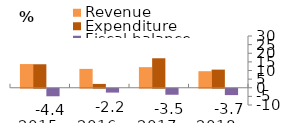
| Category | Revenue  | Expenditure  | Fiscal balance |
|---|---|---|---|
| 2015 | 13.731 | 13.616 | -4.362 |
| 2016 | 10.936 | 2.225 | -2.221 |
| 2017 | 11.931 | 17.094 | -3.481 |
| 2018 | 9.593 | 10.511 | -3.685 |